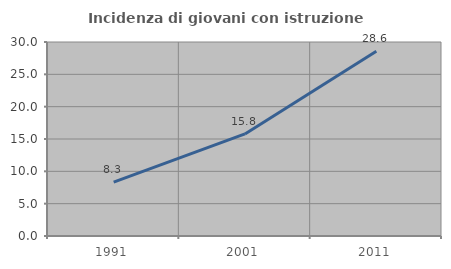
| Category | Incidenza di giovani con istruzione universitaria |
|---|---|
| 1991.0 | 8.333 |
| 2001.0 | 15.789 |
| 2011.0 | 28.571 |